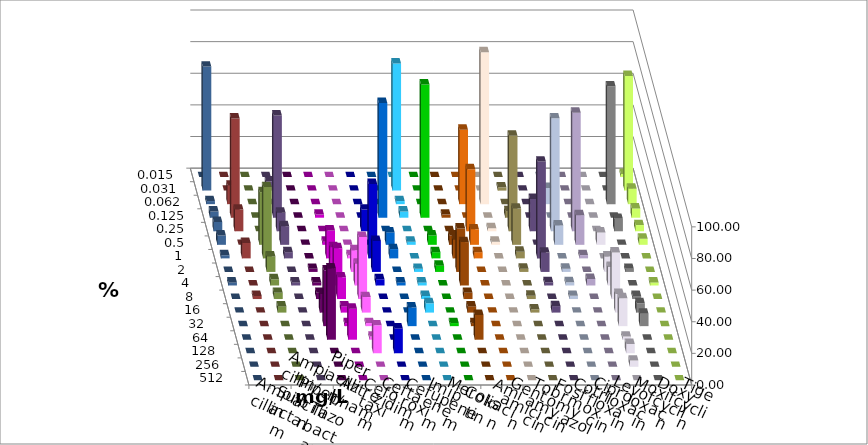
| Category | Ampicillin | Ampicillin/ Sulbactam | Piperacillin | Piperacillin/ Tazobactam | Aztreonam | Cefotaxim | Ceftazidim | Cefuroxim | Imipenem | Meropenem | Colistin | Amikacin | Gentamicin | Tobramycin | Fosfomycin | Cotrimoxazol | Ciprofloxacin | Levofloxacin | Moxifloxacin | Doxycyclin | Tigecyclin |
|---|---|---|---|---|---|---|---|---|---|---|---|---|---|---|---|---|---|---|---|---|---|
| 0.015 | 0 | 0 | 0 | 0 | 0 | 0 | 0 | 0 | 0 | 0 | 0 | 0 | 0 | 0 | 0 | 0 | 1.961 | 0 | 0 | 0 | 0 |
| 0.031 | 0 | 0 | 0 | 0 | 0 | 80.392 | 0 | 0 | 0 | 0 | 2.083 | 0 | 0 | 0 | 0 | 0 | 72.549 | 78.431 | 0 | 0 | 5.882 |
| 0.062 | 0 | 0 | 0 | 0 | 0 | 1.961 | 0 | 0 | 47.059 | 96.078 | 0 | 0 | 10.204 | 0 | 0 | 74.51 | 9.804 | 1.961 | 11.765 | 0 | 0 |
| 0.125 | 0 | 1.961 | 0 | 0 | 72.549 | 3.922 | 84.314 | 1.961 | 0 | 0 | 4.167 | 0 | 0 | 0 | 0 | 0 | 5.882 | 3.922 | 62.745 | 0 | 64.706 |
| 0.25 | 0 | 0 | 0 | 13.725 | 0 | 0 | 0 | 0 | 39.216 | 1.961 | 60.417 | 20.408 | 71.429 | 75 | 0 | 7.843 | 3.922 | 5.882 | 13.725 | 0 | 11.765 |
| 0.5 | 0 | 1.961 | 0 | 0 | 7.843 | 1.961 | 5.882 | 5.882 | 9.804 | 1.961 | 22.917 | 0 | 12.245 | 18.75 | 7.843 | 0 | 3.922 | 5.882 | 0 | 33.333 | 11.765 |
| 1.0 | 0 | 17.647 | 1.961 | 47.059 | 5.882 | 0 | 3.922 | 11.765 | 3.922 | 0 | 4.167 | 61.224 | 0 | 2.083 | 0 | 0 | 0 | 1.961 | 9.804 | 45.098 | 3.922 |
| 2.0 | 1.961 | 15.686 | 13.725 | 19.608 | 0 | 1.961 | 3.922 | 27.451 | 0 | 0 | 2.083 | 12.245 | 2.041 | 0 | 9.804 | 1.961 | 0 | 0 | 0 | 9.804 | 0 |
| 4.0 | 1.961 | 23.529 | 13.725 | 3.922 | 1.961 | 1.961 | 0 | 27.451 | 0 | 0 | 0 | 2.041 | 2.041 | 4.167 | 11.765 | 0 | 1.961 | 1.961 | 0 | 3.922 | 1.961 |
| 8.0 | 3.922 | 13.725 | 39.216 | 0 | 0 | 1.961 | 0 | 3.922 | 0 | 0 | 2.083 | 0 | 2.041 | 0 | 29.412 | 1.961 | 0 | 0 | 1.961 | 3.922 | 0 |
| 16.0 | 11.765 | 3.922 | 9.804 | 0 | 0 | 5.882 | 0 | 3.922 | 0 | 0 | 2.083 | 4.082 | 0 | 0 | 11.765 | 5.882 | 0 | 0 | 0 | 3.922 | 0 |
| 32.0 | 35.294 | 1.961 | 1.961 | 0 | 11.765 | 0 | 1.961 | 1.961 | 0 | 0 | 0 | 0 | 0 | 0 | 17.647 | 7.843 | 0 | 0 | 0 | 0 | 0 |
| 64.0 | 45.098 | 19.608 | 1.961 | 0 | 0 | 0 | 0 | 15.686 | 0 | 0 | 0 | 0 | 0 | 0 | 1.961 | 0 | 0 | 0 | 0 | 0 | 0 |
| 128.0 | 0 | 0 | 17.647 | 15.686 | 0 | 0 | 0 | 0 | 0 | 0 | 0 | 0 | 0 | 0 | 5.882 | 0 | 0 | 0 | 0 | 0 | 0 |
| 256.0 | 0 | 0 | 0 | 0 | 0 | 0 | 0 | 0 | 0 | 0 | 0 | 0 | 0 | 0 | 3.922 | 0 | 0 | 0 | 0 | 0 | 0 |
| 512.0 | 0 | 0 | 0 | 0 | 0 | 0 | 0 | 0 | 0 | 0 | 0 | 0 | 0 | 0 | 0 | 0 | 0 | 0 | 0 | 0 | 0 |